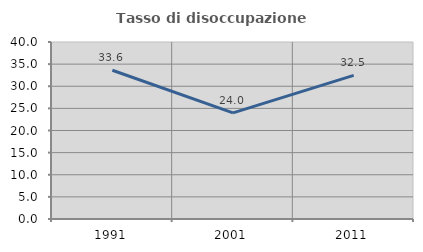
| Category | Tasso di disoccupazione giovanile  |
|---|---|
| 1991.0 | 33.612 |
| 2001.0 | 23.99 |
| 2011.0 | 32.462 |